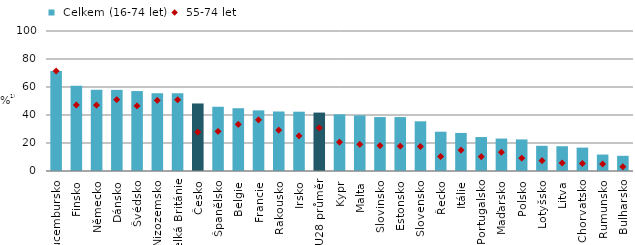
| Category |  Celkem (16-74 let) |
|---|---|
| Lucembursko | 71.466 |
| Finsko | 60.829 |
| Německo | 58.001 |
| Dánsko | 57.931 |
| Švédsko | 57.104 |
| Nizozemsko | 55.597 |
| Velká Británie | 55.594 |
| Česko | 48.24 |
| Španělsko | 45.888 |
| Belgie | 44.845 |
| Francie | 43.312 |
| Rakousko | 42.514 |
| Irsko | 42.364 |
| EU28 průměr | 41.736 |
| Kypr | 40.473 |
| Malta | 39.732 |
| Slovinsko | 38.536 |
| Estonsko | 38.512 |
| Slovensko | 35.486 |
| Řecko | 28.07 |
| Itálie | 27.185 |
| Portugalsko | 24.258 |
| Maďarsko | 23.176 |
| Polsko | 22.559 |
| Lotyšsko | 17.998 |
| Litva | 17.692 |
| Chorvatsko | 16.697 |
| Rumunsko | 11.758 |
| Bulharsko | 10.865 |